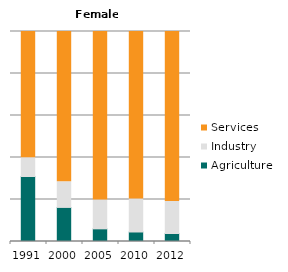
| Category | Agriculture | Industry | Services |
|---|---|---|---|
| 1991.0 | 30.964 | 8.959 | 60.077 |
| 2000.0 | 16.231 | 12.196 | 71.574 |
| 2005.0 | 6.031 | 13.723 | 80.246 |
| 2010.0 | 4.529 | 15.766 | 79.706 |
| 2012.0 | 3.798 | 15.269 | 80.932 |